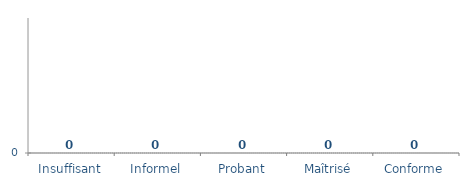
| Category | Conformités |
|---|---|
| Insuffisant | 0 |
| Informel | 0 |
| Probant | 0 |
| Maîtrisé | 0 |
| Conforme | 0 |